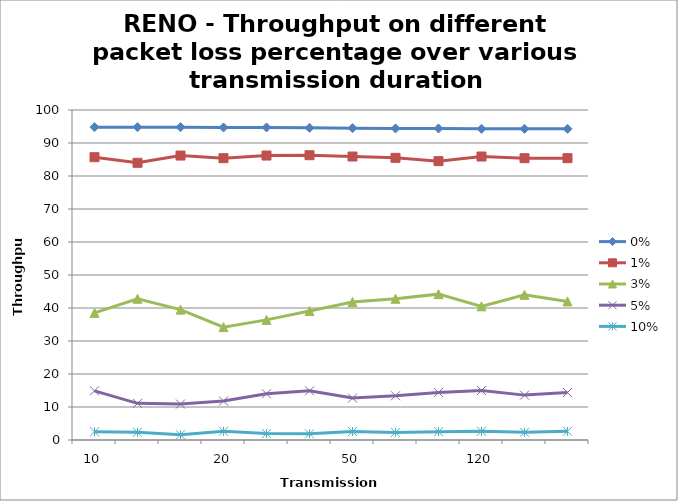
| Category | 0% | 1% | 3% | 5% | 10% |
|---|---|---|---|---|---|
| 10.0 | 94.8 | 85.7 | 38.5 | 14.9 | 2.48 |
| nan | 94.8 | 84 | 42.8 | 11.1 | 2.34 |
| nan | 94.8 | 86.2 | 39.5 | 10.9 | 1.59 |
| 20.0 | 94.7 | 85.4 | 34.2 | 11.8 | 2.64 |
| nan | 94.7 | 86.2 | 36.4 | 14 | 1.95 |
| nan | 94.6 | 86.3 | 39.1 | 14.9 | 1.86 |
| 50.0 | 94.5 | 85.9 | 41.8 | 12.7 | 2.57 |
| nan | 94.4 | 85.5 | 42.8 | 13.4 | 2.31 |
| nan | 94.4 | 84.5 | 44.2 | 14.4 | 2.52 |
| 120.0 | 94.3 | 85.9 | 40.5 | 15 | 2.66 |
| nan | 94.3 | 85.4 | 44 | 13.6 | 2.33 |
| nan | 94.3 | 85.4 | 42 | 14.4 | 2.62 |